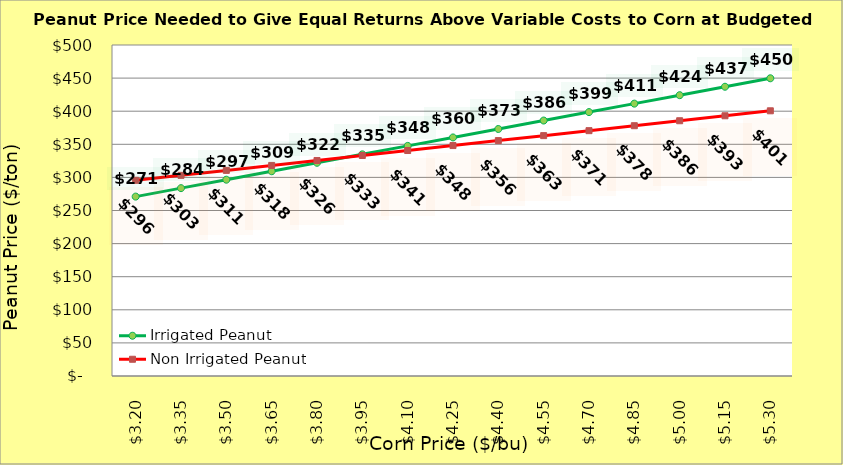
| Category | Irrigated Peanut | Non Irrigated Peanut |
|---|---|---|
| 3.2 | 270.997 | 295.589 |
| 3.35 | 283.763 | 303.089 |
| 3.5 | 296.529 | 310.589 |
| 3.65 | 309.295 | 318.089 |
| 3.8 | 322.061 | 325.589 |
| 3.9499999999999997 | 334.827 | 333.089 |
| 4.1 | 347.593 | 340.589 |
| 4.25 | 360.359 | 348.089 |
| 4.4 | 373.125 | 355.589 |
| 4.550000000000001 | 385.891 | 363.089 |
| 4.700000000000001 | 398.657 | 370.589 |
| 4.850000000000001 | 411.423 | 378.089 |
| 5.000000000000002 | 424.189 | 385.589 |
| 5.150000000000002 | 436.955 | 393.089 |
| 5.3000000000000025 | 449.721 | 400.589 |